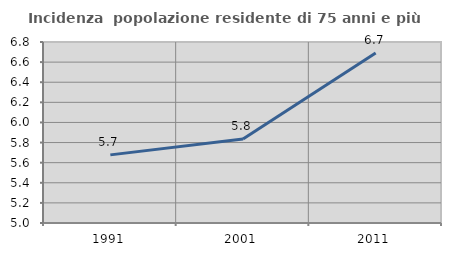
| Category | Incidenza  popolazione residente di 75 anni e più |
|---|---|
| 1991.0 | 5.677 |
| 2001.0 | 5.836 |
| 2011.0 | 6.691 |